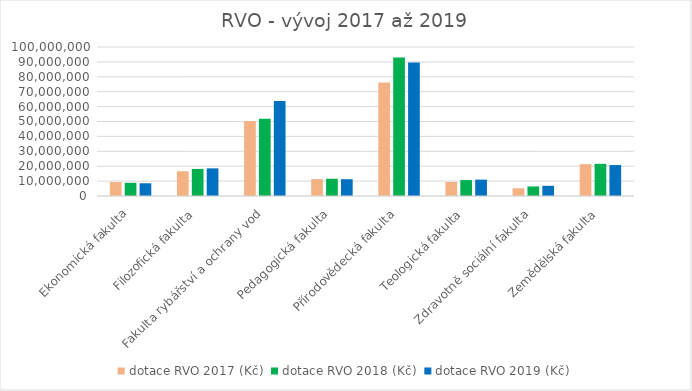
| Category | dotace RVO 2017 (Kč) | dotace RVO 2018 (Kč) | dotace RVO 2019 (Kč) |
|---|---|---|---|
| Ekonomická fakulta | 9346946 | 8852844 | 8539741 |
| Filozofická fakulta | 16608086 | 18171550 | 18546423 |
| Fakulta rybářství a ochrany vod | 50347061 | 51821464 | 63721493 |
| Pedagogická fakulta | 11309662 | 11586620 | 11274733 |
| Přírodovědecká fakulta | 76205207 | 92992436 | 89563833 |
| Teologická fakulta | 9416647 | 10667823 | 10981105 |
| Zdravotně sociální fakulta | 5177501 | 6423662 | 6831790 |
| Zemědělská fakulta | 21360361 | 21597839 | 20766897 |